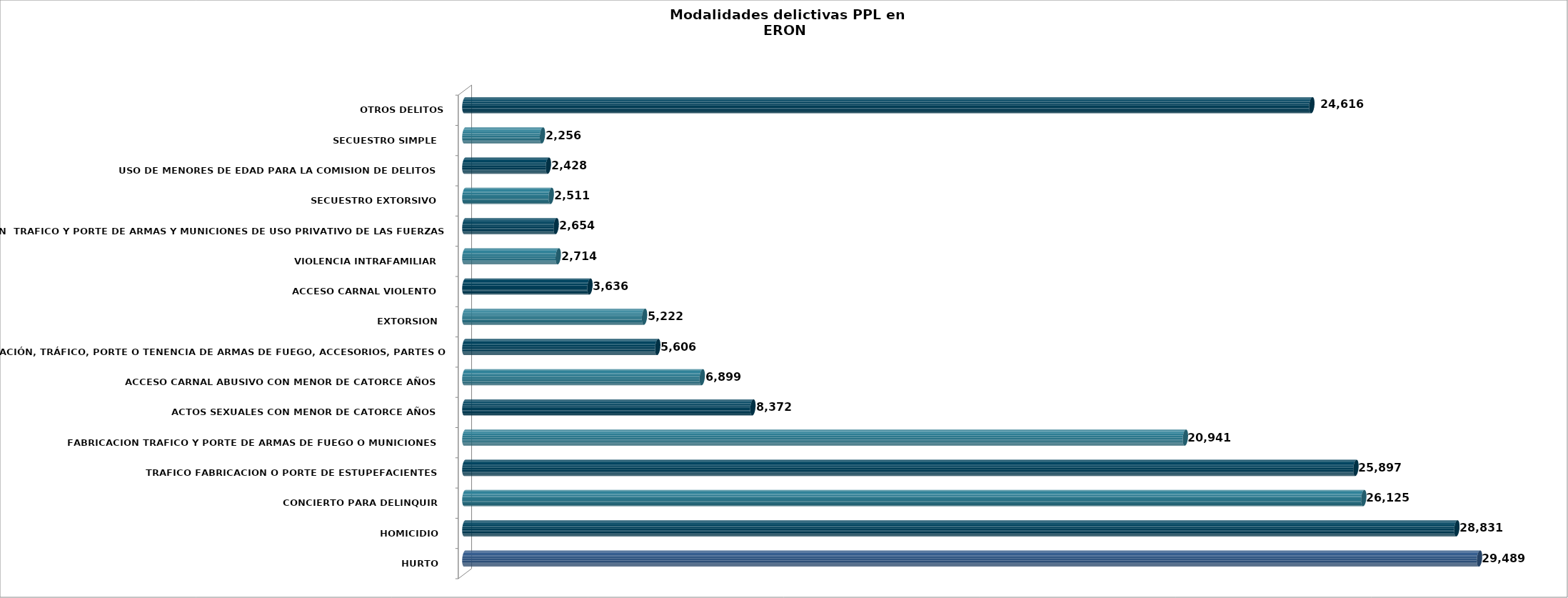
| Category | Series 0 |
|---|---|
| HURTO   | 29489 |
| HOMICIDIO   | 28831 |
| CONCIERTO PARA DELINQUIR   | 26125 |
| TRAFICO FABRICACION O PORTE DE ESTUPEFACIENTES   | 25897 |
| FABRICACION TRAFICO Y PORTE DE ARMAS DE FUEGO O MUNICIONES   | 20941 |
| ACTOS SEXUALES CON MENOR DE CATORCE AÑOS   | 8372 |
| ACCESO CARNAL ABUSIVO CON MENOR DE CATORCE AÑOS   | 6899 |
| FABRICACIÓN, TRÁFICO, PORTE O TENENCIA DE ARMAS DE FUEGO, ACCESORIOS, PARTES O MUNICIONES   | 5606 |
| EXTORSION   | 5222 |
| ACCESO CARNAL VIOLENTO   | 3636 |
| VIOLENCIA INTRAFAMILIAR   | 2714 |
| FABRICACION  TRAFICO Y PORTE DE ARMAS Y MUNICIONES DE USO PRIVATIVO DE LAS FUERZAS ARMADAS   | 2654 |
| SECUESTRO EXTORSIVO   | 2511 |
| USO DE MENORES DE EDAD PARA LA COMISION DE DELITOS   | 2428 |
| SECUESTRO SIMPLE   | 2256 |
| OTROS DELITOS | 24616 |